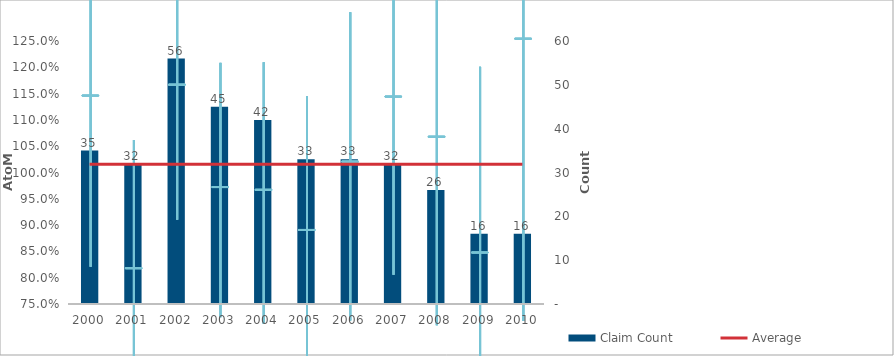
| Category | Claim Count |
|---|---|
| 0 | 35 |
| 1 | 32 |
| 2 | 56 |
| 3 | 45 |
| 4 | 42 |
| 5 | 33 |
| 6 | 33 |
| 7 | 32 |
| 8 | 26 |
| 9 | 16 |
| 10 | 16 |